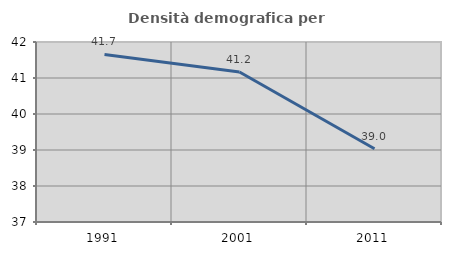
| Category | Densità demografica |
|---|---|
| 1991.0 | 41.654 |
| 2001.0 | 41.165 |
| 2011.0 | 39.037 |